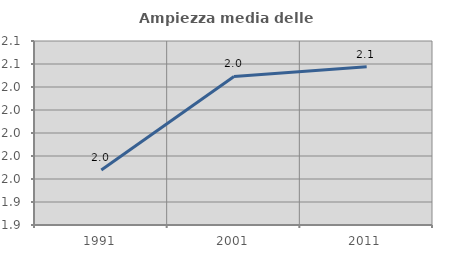
| Category | Ampiezza media delle famiglie |
|---|---|
| 1991.0 | 1.968 |
| 2001.0 | 2.049 |
| 2011.0 | 2.058 |